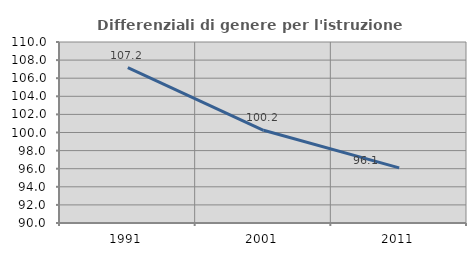
| Category | Differenziali di genere per l'istruzione superiore |
|---|---|
| 1991.0 | 107.165 |
| 2001.0 | 100.244 |
| 2011.0 | 96.086 |